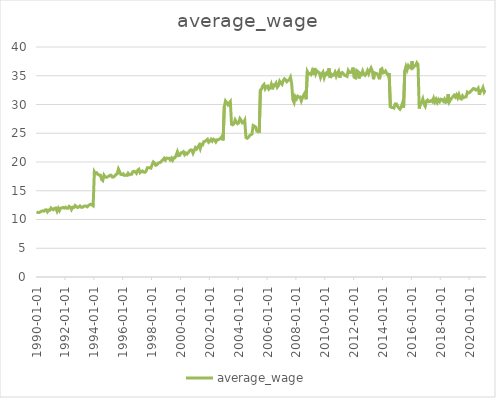
| Category | average_wage |
|---|---|
| 1990-01-01 | 11.34 |
| 1990-02-01 | 11.216 |
| 1990-03-01 | 11.213 |
| 1990-04-01 | 11.312 |
| 1990-05-01 | 11.449 |
| 1990-06-01 | 11.482 |
| 1990-07-01 | 11.455 |
| 1990-08-01 | 11.639 |
| 1990-09-01 | 11.684 |
| 1990-10-01 | 11.331 |
| 1990-11-01 | 11.64 |
| 1990-12-01 | 11.618 |
| 1991-01-01 | 12.002 |
| 1991-02-01 | 11.798 |
| 1991-03-01 | 11.694 |
| 1991-04-01 | 11.968 |
| 1991-05-01 | 11.991 |
| 1991-06-01 | 11.443 |
| 1991-07-01 | 11.943 |
| 1991-08-01 | 11.548 |
| 1991-09-01 | 11.981 |
| 1991-10-01 | 12.016 |
| 1991-11-01 | 12.102 |
| 1991-12-01 | 11.985 |
| 1992-01-01 | 12.137 |
| 1992-02-01 | 11.974 |
| 1992-03-01 | 11.954 |
| 1992-04-01 | 12.283 |
| 1992-05-01 | 12.161 |
| 1992-06-01 | 11.74 |
| 1992-07-01 | 12.119 |
| 1992-08-01 | 12.097 |
| 1992-09-01 | 12.437 |
| 1992-10-01 | 12.261 |
| 1992-11-01 | 12.074 |
| 1992-12-01 | 12.148 |
| 1993-01-01 | 12.346 |
| 1993-02-01 | 12.134 |
| 1993-03-01 | 12.11 |
| 1993-04-01 | 12.269 |
| 1993-05-01 | 12.361 |
| 1993-06-01 | 12.333 |
| 1993-07-01 | 12.213 |
| 1993-08-01 | 12.421 |
| 1993-09-01 | 12.568 |
| 1993-10-01 | 12.655 |
| 1993-11-01 | 12.539 |
| 1993-12-01 | 12.385 |
| 1994-01-01 | 18.299 |
| 1994-02-01 | 17.965 |
| 1994-03-01 | 18.115 |
| 1994-04-01 | 17.834 |
| 1994-05-01 | 17.739 |
| 1994-06-01 | 17.719 |
| 1994-07-01 | 16.962 |
| 1994-08-01 | 16.776 |
| 1994-09-01 | 17.714 |
| 1994-10-01 | 17.405 |
| 1994-11-01 | 17.336 |
| 1994-12-01 | 17.43 |
| 1995-01-01 | 17.515 |
| 1995-02-01 | 17.683 |
| 1995-03-01 | 17.683 |
| 1995-04-01 | 17.36 |
| 1995-05-01 | 17.396 |
| 1995-06-01 | 17.586 |
| 1995-07-01 | 17.831 |
| 1995-08-01 | 17.945 |
| 1995-09-01 | 18.784 |
| 1995-10-01 | 18.341 |
| 1995-11-01 | 17.848 |
| 1995-12-01 | 17.803 |
| 1996-01-01 | 17.941 |
| 1996-02-01 | 17.665 |
| 1996-03-01 | 17.712 |
| 1996-04-01 | 17.681 |
| 1996-05-01 | 18.045 |
| 1996-06-01 | 17.77 |
| 1996-07-01 | 17.864 |
| 1996-08-01 | 17.867 |
| 1996-09-01 | 18.321 |
| 1996-10-01 | 18.392 |
| 1996-11-01 | 18.282 |
| 1996-12-01 | 18.04 |
| 1997-01-01 | 18.536 |
| 1997-02-01 | 18.738 |
| 1997-03-01 | 18.151 |
| 1997-04-01 | 18.32 |
| 1997-05-01 | 18.455 |
| 1997-06-01 | 18.244 |
| 1997-07-01 | 18.213 |
| 1997-08-01 | 18.414 |
| 1997-09-01 | 18.988 |
| 1997-10-01 | 18.991 |
| 1997-11-01 | 18.997 |
| 1997-12-01 | 18.933 |
| 1998-01-01 | 19.514 |
| 1998-02-01 | 20.005 |
| 1998-03-01 | 19.827 |
| 1998-04-01 | 19.437 |
| 1998-05-01 | 19.52 |
| 1998-06-01 | 19.795 |
| 1998-07-01 | 19.896 |
| 1998-08-01 | 19.946 |
| 1998-09-01 | 20.198 |
| 1998-10-01 | 20.391 |
| 1998-11-01 | 20.645 |
| 1998-12-01 | 20.335 |
| 1999-01-01 | 20.681 |
| 1999-02-01 | 20.644 |
| 1999-03-01 | 20.647 |
| 1999-04-01 | 20.373 |
| 1999-05-01 | 20.665 |
| 1999-06-01 | 20.314 |
| 1999-07-01 | 20.73 |
| 1999-08-01 | 20.745 |
| 1999-09-01 | 21.187 |
| 1999-10-01 | 21.776 |
| 1999-11-01 | 21.104 |
| 1999-12-01 | 21.157 |
| 2000-01-01 | 21.599 |
| 2000-02-01 | 21.627 |
| 2000-03-01 | 21.792 |
| 2000-04-01 | 21.286 |
| 2000-05-01 | 21.562 |
| 2000-06-01 | 21.379 |
| 2000-07-01 | 21.626 |
| 2000-08-01 | 21.926 |
| 2000-09-01 | 22.102 |
| 2000-10-01 | 22.072 |
| 2000-11-01 | 21.526 |
| 2000-12-01 | 22.011 |
| 2001-01-01 | 22.498 |
| 2001-02-01 | 22.27 |
| 2001-03-01 | 22.595 |
| 2001-04-01 | 22.922 |
| 2001-05-01 | 22.322 |
| 2001-06-01 | 23.072 |
| 2001-07-01 | 22.981 |
| 2001-08-01 | 23.551 |
| 2001-09-01 | 23.597 |
| 2001-10-01 | 23.773 |
| 2001-11-01 | 23.947 |
| 2001-12-01 | 23.436 |
| 2002-01-01 | 23.614 |
| 2002-02-01 | 23.931 |
| 2002-03-01 | 23.625 |
| 2002-04-01 | 23.959 |
| 2002-05-01 | 23.842 |
| 2002-06-01 | 23.499 |
| 2002-07-01 | 23.867 |
| 2002-08-01 | 23.873 |
| 2002-09-01 | 23.979 |
| 2002-10-01 | 24.154 |
| 2002-11-01 | 24.426 |
| 2002-12-01 | 23.759 |
| 2003-01-01 | 29.643 |
| 2003-02-01 | 30.607 |
| 2003-03-01 | 30.303 |
| 2003-04-01 | 29.955 |
| 2003-05-01 | 30.28 |
| 2003-06-01 | 30.531 |
| 2003-07-01 | 26.583 |
| 2003-08-01 | 26.478 |
| 2003-09-01 | 26.643 |
| 2003-10-01 | 27.334 |
| 2003-11-01 | 26.958 |
| 2003-12-01 | 26.669 |
| 2004-01-01 | 26.826 |
| 2004-02-01 | 27.552 |
| 2004-03-01 | 27.262 |
| 2004-04-01 | 26.788 |
| 2004-05-01 | 26.858 |
| 2004-06-01 | 27.253 |
| 2004-07-01 | 24.242 |
| 2004-08-01 | 24.121 |
| 2004-09-01 | 24.279 |
| 2004-10-01 | 24.567 |
| 2004-11-01 | 24.757 |
| 2004-12-01 | 24.86 |
| 2005-01-01 | 26.348 |
| 2005-02-01 | 26.246 |
| 2005-03-01 | 26.091 |
| 2005-04-01 | 25.393 |
| 2005-05-01 | 25.441 |
| 2005-06-01 | 25.054 |
| 2005-07-01 | 32.504 |
| 2005-08-01 | 32.671 |
| 2005-09-01 | 33.284 |
| 2005-10-01 | 33.499 |
| 2005-11-01 | 32.747 |
| 2005-12-01 | 33.109 |
| 2006-01-01 | 33.21 |
| 2006-02-01 | 32.661 |
| 2006-03-01 | 32.881 |
| 2006-04-01 | 33.5 |
| 2006-05-01 | 32.643 |
| 2006-06-01 | 33.399 |
| 2006-07-01 | 33.327 |
| 2006-08-01 | 33.709 |
| 2006-09-01 | 32.995 |
| 2006-10-01 | 33.278 |
| 2006-11-01 | 34.055 |
| 2006-12-01 | 33.746 |
| 2007-01-01 | 33.501 |
| 2007-02-01 | 34.167 |
| 2007-03-01 | 34.467 |
| 2007-04-01 | 34.289 |
| 2007-05-01 | 33.967 |
| 2007-06-01 | 34.177 |
| 2007-07-01 | 34.317 |
| 2007-08-01 | 34.74 |
| 2007-09-01 | 33.624 |
| 2007-10-01 | 30.803 |
| 2007-11-01 | 30.332 |
| 2007-12-01 | 31.356 |
| 2008-01-01 | 30.992 |
| 2008-02-01 | 31.433 |
| 2008-03-01 | 31.261 |
| 2008-04-01 | 31.305 |
| 2008-05-01 | 30.627 |
| 2008-06-01 | 31.203 |
| 2008-07-01 | 31.653 |
| 2008-08-01 | 32.034 |
| 2008-09-01 | 30.908 |
| 2008-10-01 | 35.744 |
| 2008-11-01 | 35.355 |
| 2008-12-01 | 35.381 |
| 2009-01-01 | 35.213 |
| 2009-02-01 | 35.836 |
| 2009-03-01 | 35.202 |
| 2009-04-01 | 36.342 |
| 2009-05-01 | 35.348 |
| 2009-06-01 | 35.846 |
| 2009-07-01 | 35.636 |
| 2009-08-01 | 35.512 |
| 2009-09-01 | 34.701 |
| 2009-10-01 | 35.294 |
| 2009-11-01 | 35.627 |
| 2009-12-01 | 34.694 |
| 2010-01-01 | 35.332 |
| 2010-02-01 | 35.528 |
| 2010-03-01 | 34.948 |
| 2010-04-01 | 36.284 |
| 2010-05-01 | 34.613 |
| 2010-06-01 | 35.254 |
| 2010-07-01 | 35.031 |
| 2010-08-01 | 35.143 |
| 2010-09-01 | 35.597 |
| 2010-10-01 | 34.923 |
| 2010-11-01 | 35.453 |
| 2010-12-01 | 35.802 |
| 2011-01-01 | 34.667 |
| 2011-02-01 | 35.474 |
| 2011-03-01 | 35.563 |
| 2011-04-01 | 35.344 |
| 2011-05-01 | 35.071 |
| 2011-06-01 | 35.012 |
| 2011-07-01 | 34.895 |
| 2011-08-01 | 35.909 |
| 2011-09-01 | 35.565 |
| 2011-10-01 | 35.538 |
| 2011-11-01 | 35.787 |
| 2011-12-01 | 36.413 |
| 2012-01-01 | 34.742 |
| 2012-02-01 | 34.624 |
| 2012-03-01 | 35.925 |
| 2012-04-01 | 35.759 |
| 2012-05-01 | 34.521 |
| 2012-06-01 | 35.385 |
| 2012-07-01 | 35.205 |
| 2012-08-01 | 35.812 |
| 2012-09-01 | 35.238 |
| 2012-10-01 | 35.062 |
| 2012-11-01 | 35.394 |
| 2012-12-01 | 35.899 |
| 2013-01-01 | 35.359 |
| 2013-02-01 | 35.929 |
| 2013-03-01 | 36.353 |
| 2013-04-01 | 35.834 |
| 2013-05-01 | 34.397 |
| 2013-06-01 | 35.505 |
| 2013-07-01 | 35.437 |
| 2013-08-01 | 35.335 |
| 2013-09-01 | 34.979 |
| 2013-10-01 | 34.396 |
| 2013-11-01 | 36.085 |
| 2013-12-01 | 36.231 |
| 2014-01-01 | 35.508 |
| 2014-02-01 | 35.581 |
| 2014-03-01 | 35.832 |
| 2014-04-01 | 35.419 |
| 2014-05-01 | 35.091 |
| 2014-06-01 | 35.49 |
| 2014-07-01 | 29.612 |
| 2014-08-01 | 29.498 |
| 2014-09-01 | 29.484 |
| 2014-10-01 | 29.389 |
| 2014-11-01 | 30.088 |
| 2014-12-01 | 30.106 |
| 2015-01-01 | 29.682 |
| 2015-02-01 | 29.415 |
| 2015-03-01 | 29.185 |
| 2015-04-01 | 29.536 |
| 2015-05-01 | 30.219 |
| 2015-06-01 | 29.463 |
| 2015-07-01 | 35.849 |
| 2015-08-01 | 36.626 |
| 2015-09-01 | 36.06 |
| 2015-10-01 | 36.761 |
| 2015-11-01 | 36.473 |
| 2015-12-01 | 36.335 |
| 2016-01-01 | 37.517 |
| 2016-02-01 | 36.444 |
| 2016-03-01 | 36.68 |
| 2016-04-01 | 36.779 |
| 2016-05-01 | 37.256 |
| 2016-06-01 | 36.959 |
| 2016-07-01 | 29.303 |
| 2016-08-01 | 30.16 |
| 2016-09-01 | 30.367 |
| 2016-10-01 | 30.962 |
| 2016-11-01 | 30.075 |
| 2016-12-01 | 29.682 |
| 2017-01-01 | 30.585 |
| 2017-02-01 | 30.781 |
| 2017-03-01 | 30.504 |
| 2017-04-01 | 30.537 |
| 2017-05-01 | 30.689 |
| 2017-06-01 | 30.473 |
| 2017-07-01 | 31.085 |
| 2017-08-01 | 30.47 |
| 2017-09-01 | 30.903 |
| 2017-10-01 | 30.365 |
| 2017-11-01 | 30.84 |
| 2017-12-01 | 30.508 |
| 2018-01-01 | 30.922 |
| 2018-02-01 | 30.856 |
| 2018-03-01 | 30.574 |
| 2018-04-01 | 30.924 |
| 2018-05-01 | 30.37 |
| 2018-06-01 | 30.429 |
| 2018-07-01 | 31.785 |
| 2018-08-01 | 30.438 |
| 2018-09-01 | 30.809 |
| 2018-10-01 | 31.126 |
| 2018-11-01 | 31.364 |
| 2018-12-01 | 31.607 |
| 2019-01-01 | 31.301 |
| 2019-02-01 | 31.671 |
| 2019-03-01 | 31.156 |
| 2019-04-01 | 31.731 |
| 2019-05-01 | 31.079 |
| 2019-06-01 | 30.956 |
| 2019-07-01 | 31.499 |
| 2019-08-01 | 31.202 |
| 2019-09-01 | 31.316 |
| 2019-10-01 | 31.33 |
| 2019-11-01 | 32.161 |
| 2019-12-01 | 32.015 |
| 2020-01-01 | 32.095 |
| 2020-02-01 | 32.348 |
| 2020-03-01 | 32.548 |
| 2020-04-01 | 32.771 |
| 2020-05-01 | 32.742 |
| 2020-06-01 | 32.506 |
| 2020-07-01 | 32.552 |
| 2020-08-01 | 32.823 |
| 2020-09-01 | 31.685 |
| 2020-10-01 | 32.418 |
| 2020-11-01 | 32.433 |
| 2020-12-01 | 32.936 |
| 2021-01-01 | 32.17 |
| 2021-02-01 | 32.546 |